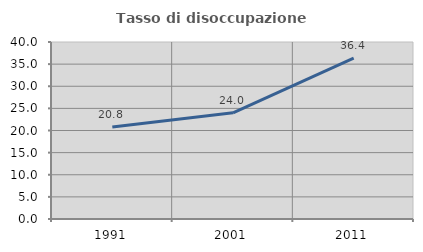
| Category | Tasso di disoccupazione giovanile  |
|---|---|
| 1991.0 | 20.779 |
| 2001.0 | 24 |
| 2011.0 | 36.364 |